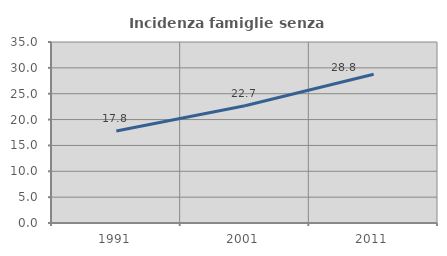
| Category | Incidenza famiglie senza nuclei |
|---|---|
| 1991.0 | 17.797 |
| 2001.0 | 22.688 |
| 2011.0 | 28.756 |